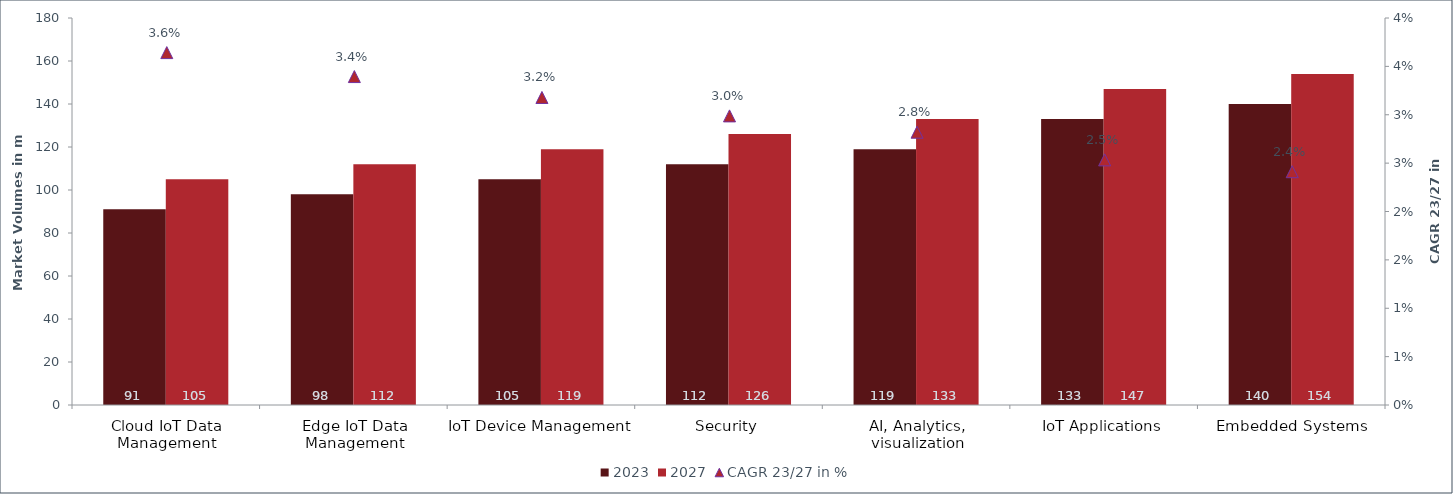
| Category | 2023 | 2027 |
|---|---|---|
| Cloud IoT Data Management | 91 | 105 |
| Edge IoT Data Management | 98 | 112 |
| IoT Device Management | 105 | 119 |
| Security | 112 | 126 |
| AI, Analytics, visualization | 119 | 133 |
| IoT Applications | 133 | 147 |
| Embedded Systems | 140 | 154 |